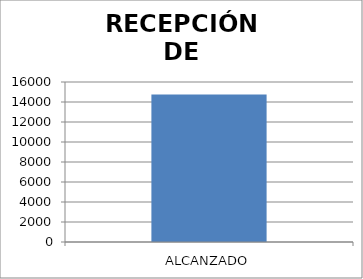
| Category | FOLIO |
|---|---|
| ALCANZADO | 14742 |